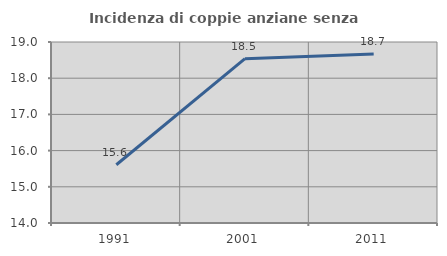
| Category | Incidenza di coppie anziane senza figli  |
|---|---|
| 1991.0 | 15.61 |
| 2001.0 | 18.539 |
| 2011.0 | 18.671 |